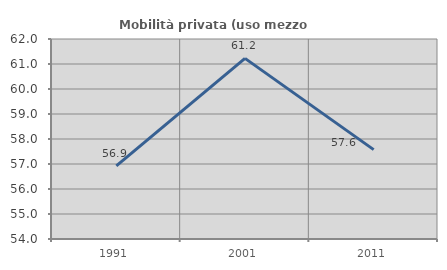
| Category | Mobilità privata (uso mezzo privato) |
|---|---|
| 1991.0 | 56.923 |
| 2001.0 | 61.224 |
| 2011.0 | 57.576 |